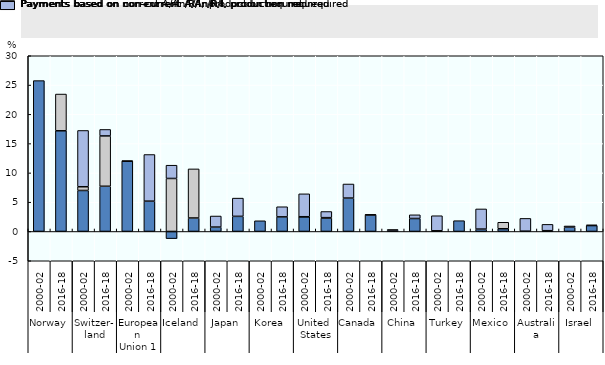
| Category | Payments based on current A/An/R/I, production required | Payments based on non-current A/An/R/I, production required | Payments based on non-current A/An/R/I, production not required |
|---|---|---|---|
| 0 | 25.758 | 0 | 0 |
| 1 | 17.188 | 6.274 | 0 |
| 2 | 6.999 | 0.635 | 9.611 |
| 3 | 7.719 | 8.593 | 1.107 |
| 4 | 12.02 | 0 | 0.004 |
| 5 | 5.173 | 0.003 | 7.962 |
| 6 | -1.222 | 9.05 | 2.265 |
| 7 | 2.303 | 8.38 | 0 |
| 8 | 0.749 | 0 | 1.89 |
| 9 | 2.58 | 0 | 3.116 |
| 10 | 1.825 | 0 | 0 |
| 11 | 2.493 | 0 | 1.729 |
| 12 | 2.517 | 0 | 3.911 |
| 13 | 2.298 | 0.06 | 1.048 |
| 14 | 5.701 | 0 | 2.405 |
| 15 | 2.837 | 0.016 | 0 |
| 16 | 0.192 | 0 | 0.134 |
| 17 | 2.216 | 0 | 0.63 |
| 18 | 0.112 | 0 | 2.577 |
| 19 | 1.842 | 0 | 0 |
| 20 | 0.405 | 0 | 3.443 |
| 21 | 0.464 | 1.107 | 0 |
| 22 | 0.052 | 0 | 2.18 |
| 23 | 0.132 | 0 | 1.079 |
| 24 | 0.715 | 0 | 0.222 |
| 25 | 1.006 | 0 | 0.116 |